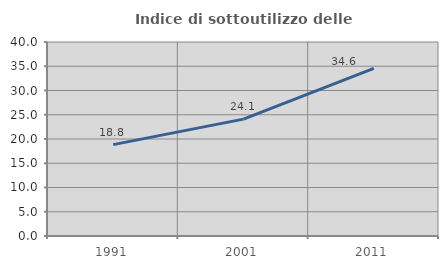
| Category | Indice di sottoutilizzo delle abitazioni  |
|---|---|
| 1991.0 | 18.84 |
| 2001.0 | 24.099 |
| 2011.0 | 34.574 |